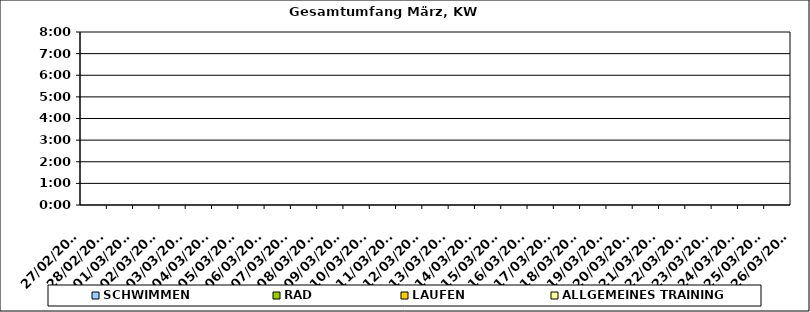
| Category | SCHWIMMEN | RAD | LAUFEN | ALLGEMEINES TRAINING |
|---|---|---|---|---|
| 27/02/2023 |  |  |  | 0 |
| 28/02/2023 |  |  |  | 0 |
| 01/03/2023 |  |  |  | 0 |
| 02/03/2023 |  |  |  | 0 |
| 03/03/2023 |  |  |  | 0 |
| 04/03/2023 |  |  |  | 0 |
| 05/03/2023 |  |  |  | 0 |
| 06/03/2023 |  |  |  | 0 |
| 07/03/2023 |  |  |  | 0 |
| 08/03/2023 |  |  |  | 0 |
| 09/03/2023 |  |  |  | 0 |
| 10/03/2023 |  |  |  | 0 |
| 11/03/2023 |  |  |  | 0 |
| 12/03/2023 |  |  |  | 0 |
| 13/03/2023 |  |  |  | 0 |
| 14/03/2023 |  |  |  | 0 |
| 15/03/2023 |  |  |  | 0 |
| 16/03/2023 |  |  |  | 0 |
| 17/03/2023 |  |  |  | 0 |
| 18/03/2023 |  |  |  | 0 |
| 19/03/2023 |  |  |  | 0 |
| 20/03/2023 |  |  |  | 0 |
| 21/03/2023 |  |  |  | 0 |
| 22/03/2023 |  |  |  | 0 |
| 23/03/2023 |  |  |  | 0 |
| 24/03/2023 |  |  |  | 0 |
| 25/03/2023 |  |  |  | 0 |
| 26/03/2023 |  |  |  | 0 |